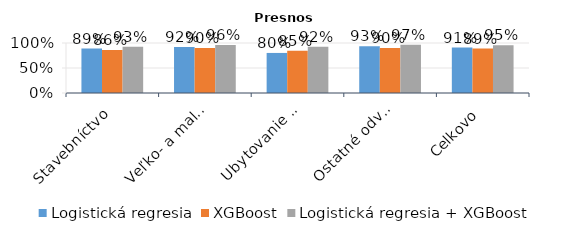
| Category | Logistická regresia | XGBoost | Logistická regresia + XGBoost |
|---|---|---|---|
| Stavebníctvo | 0.889 | 0.861 | 0.927 |
| Veľko- a maloobchod | 0.918 | 0.902 | 0.959 |
| Ubytovanie a stravovanie | 0.801 | 0.845 | 0.924 |
| Ostatné odvetvia | 0.933 | 0.901 | 0.966 |
| Celkovo | 0.909 | 0.89 | 0.954 |